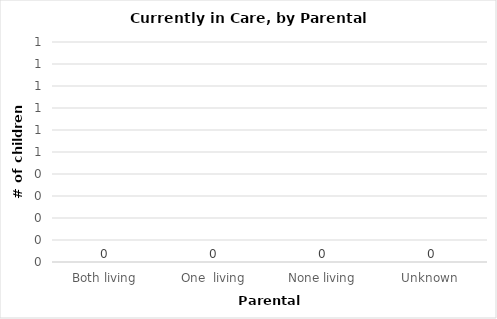
| Category | # |
|---|---|
| Both living | 0 |
| One  living | 0 |
| None living | 0 |
| Unknown  | 0 |